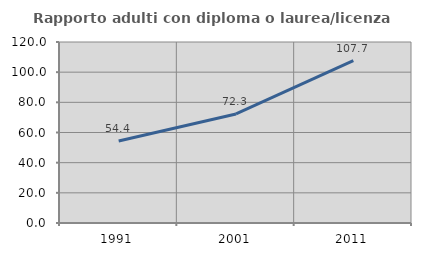
| Category | Rapporto adulti con diploma o laurea/licenza media  |
|---|---|
| 1991.0 | 54.419 |
| 2001.0 | 72.317 |
| 2011.0 | 107.717 |